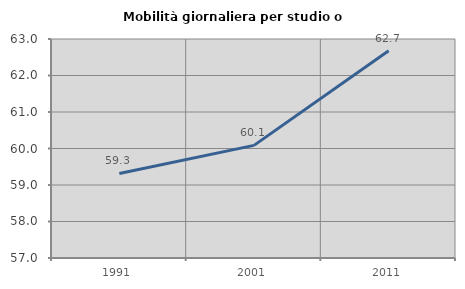
| Category | Mobilità giornaliera per studio o lavoro |
|---|---|
| 1991.0 | 59.317 |
| 2001.0 | 60.086 |
| 2011.0 | 62.68 |